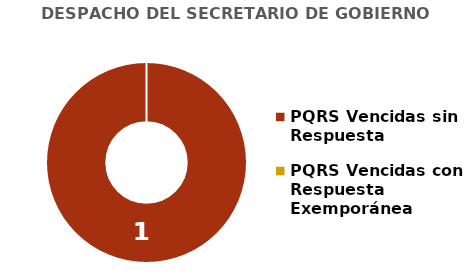
| Category | DESPACHO DEL SECRETARIO DE GOBIERNO  |
|---|---|
| PQRS Vencidas sin Respuesta | 1 |
| PQRS Vencidas con Respuesta Exemporánea | 0 |